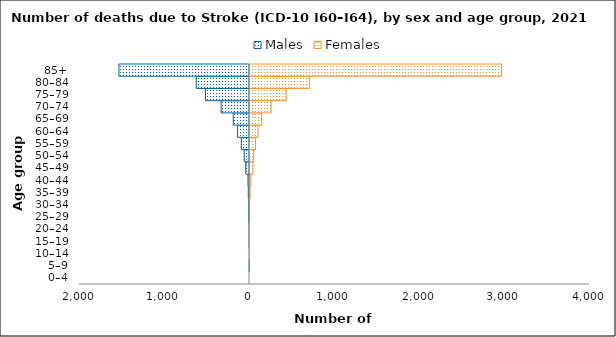
| Category | Males | Females |
|---|---|---|
| 0–4 | 0 | 0 |
| 5–9 | -2 | 0 |
| 10–14 | 0 | 1 |
| 15–19 | -2 | 2 |
| 20–24 | -2 | 2 |
| 25–29 | -8 | 2 |
| 30–34 | -6 | 7 |
| 35–39 | -14 | 12 |
| 40–44 | -18 | 22 |
| 45–49 | -44 | 47 |
| 50–54 | -62 | 54 |
| 55–59 | -96 | 76 |
| 60–64 | -140 | 105 |
| 65–69 | -191 | 147 |
| 70–74 | -334 | 260 |
| 75–79 | -518 | 437 |
| 80–84 | -626 | 710 |
| 85+ | -1536 | 2970 |